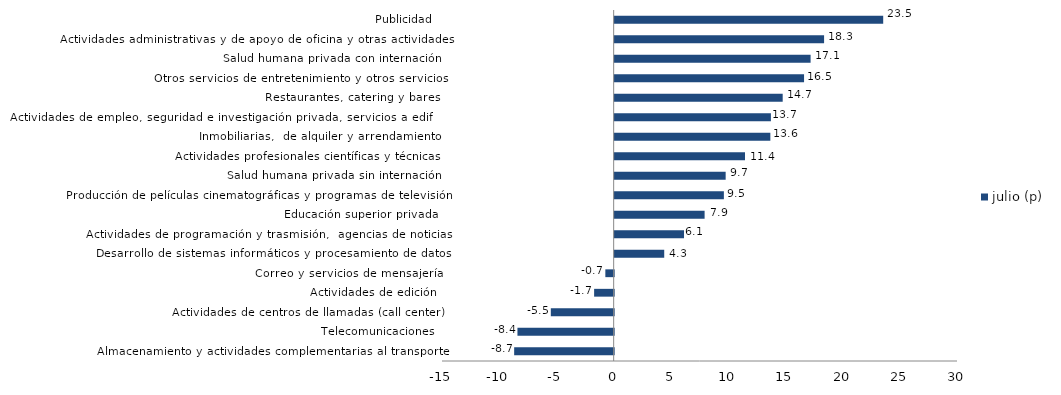
| Category | julio (p) |
|---|---|
| Almacenamiento y actividades complementarias al transporte | -8.695 |
| Telecomunicaciones | -8.407 |
| Actividades de centros de llamadas (call center) | -5.492 |
| Actividades de edición | -1.708 |
| Correo y servicios de mensajería | -0.727 |
| Desarrollo de sistemas informáticos y procesamiento de datos | 4.33 |
| Actividades de programación y trasmisión,  agencias de noticias | 6.06 |
| Educación superior privada | 7.859 |
| Producción de películas cinematográficas y programas de televisión | 9.543 |
| Salud humana privada sin internación | 9.698 |
| Actividades profesionales científicas y técnicas  | 11.389 |
| Inmobiliarias,  de alquiler y arrendamiento  | 13.604 |
| Actividades de empleo, seguridad e investigación privada, servicios a edificios | 13.651 |
| Restaurantes, catering y bares | 14.682 |
| Otros servicios de entretenimiento y otros servicios | 16.549 |
| Salud humana privada con internación | 17.12 |
| Actividades administrativas y de apoyo de oficina y otras actividades | 18.299 |
| Publicidad | 23.464 |